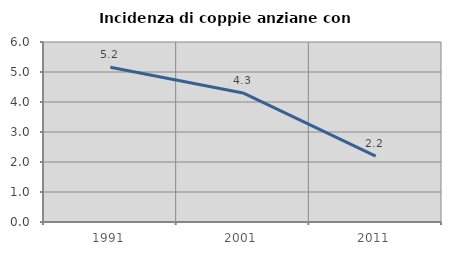
| Category | Incidenza di coppie anziane con figli |
|---|---|
| 1991.0 | 5.161 |
| 2001.0 | 4.301 |
| 2011.0 | 2.198 |